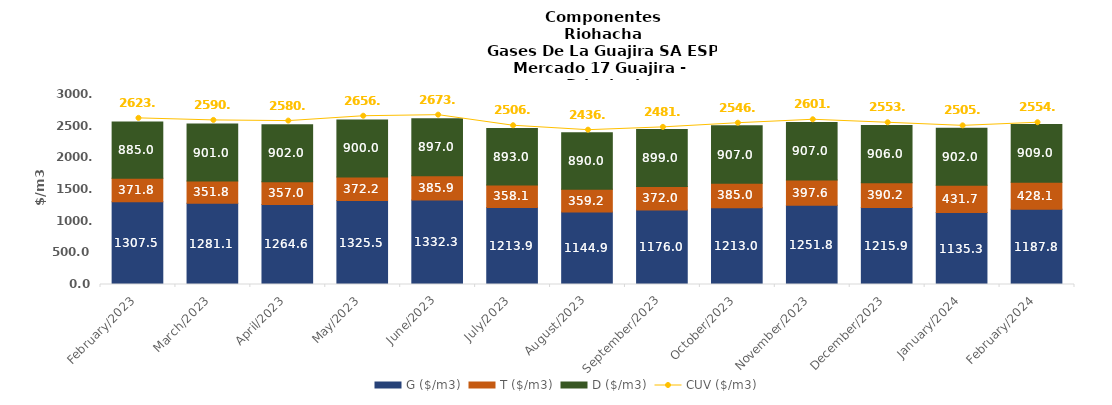
| Category | G ($/m3) | T ($/m3) | D ($/m3) |
|---|---|---|---|
| 2023-02-01 | 1307.53 | 371.84 | 885 |
| 2023-03-01 | 1281.1 | 351.77 | 901 |
| 2023-04-01 | 1264.63 | 356.99 | 902 |
| 2023-05-01 | 1325.54 | 372.19 | 900 |
| 2023-06-01 | 1332.29 | 385.86 | 897 |
| 2023-07-01 | 1213.88 | 358.06 | 893 |
| 2023-08-01 | 1144.92 | 359.17 | 890 |
| 2023-09-01 | 1176 | 372 | 899 |
| 2023-10-01 | 1213 | 385 | 907 |
| 2023-11-01 | 1251.77 | 397.64 | 907 |
| 2023-12-01 | 1215.86 | 390.2 | 906 |
| 2024-01-01 | 1135.29 | 431.72 | 902 |
| 2024-02-01 | 1187.79 | 428.07 | 909 |